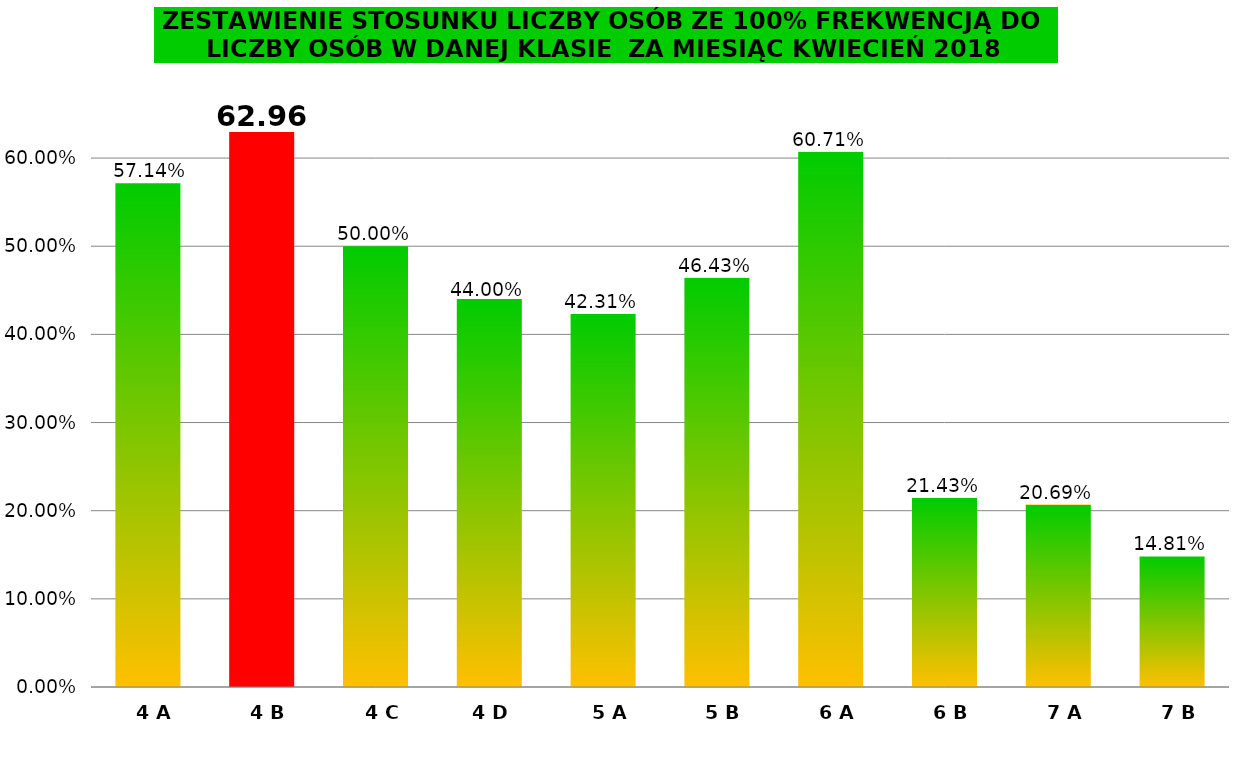
| Category | Udział uczniów w klasie ze 100% frekwencją |
|---|---|
| 4 A | 0.571 |
| 4 B | 0.63 |
| 4 C | 0.5 |
| 4 D | 0.44 |
| 5 A | 0.423 |
| 5 B | 0.464 |
| 6 A | 0.607 |
| 6 B | 0.214 |
| 7 A | 0.207 |
| 7 B | 0.148 |